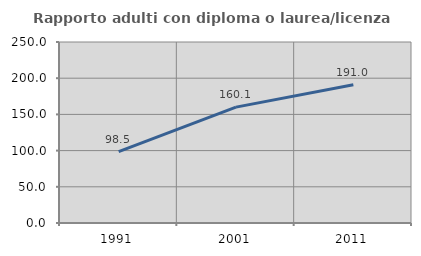
| Category | Rapporto adulti con diploma o laurea/licenza media  |
|---|---|
| 1991.0 | 98.544 |
| 2001.0 | 160.071 |
| 2011.0 | 190.972 |